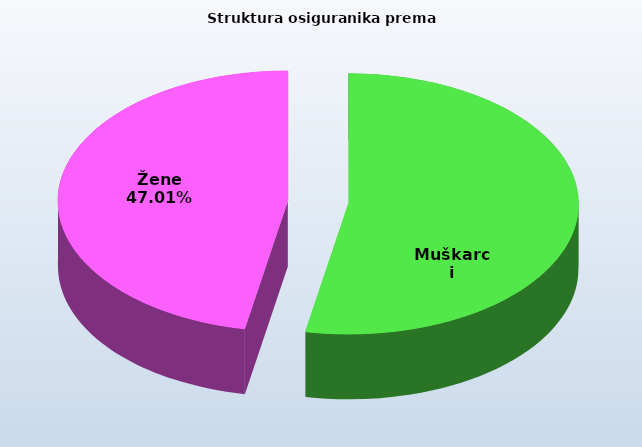
| Category | Series 0 |
|---|---|
| Muškarci | 819031 |
| Žene | 726535 |